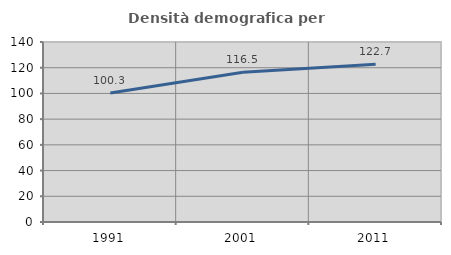
| Category | Densità demografica |
|---|---|
| 1991.0 | 100.329 |
| 2001.0 | 116.512 |
| 2011.0 | 122.699 |